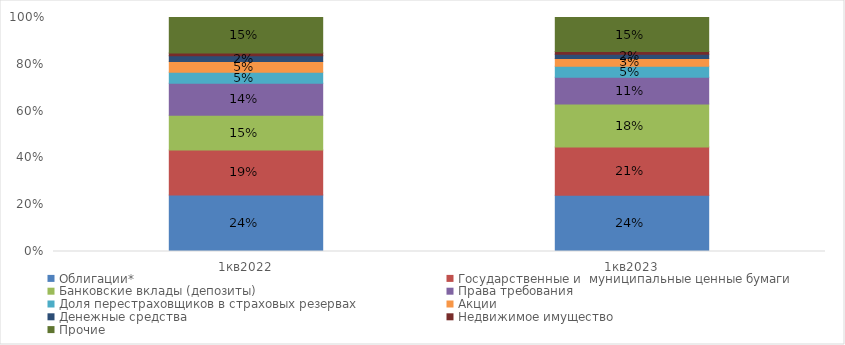
| Category | Облигации* | Государственные и  муниципальные ценные бумаги | Банковские вклады (депозиты) | Права требования | Доля перестраховщиков в страховых резервах | Акции  | Денежные средства | Недвижимое имущество | Прочие |
|---|---|---|---|---|---|---|---|---|---|
| 1кв2022 | 0.241 | 0.193 | 0.148 | 0.137 | 0.047 | 0.046 | 0.024 | 0.012 | 0.152 |
| 1кв2023 | 0.241 | 0.206 | 0.184 | 0.115 | 0.047 | 0.034 | 0.018 | 0.011 | 0.145 |